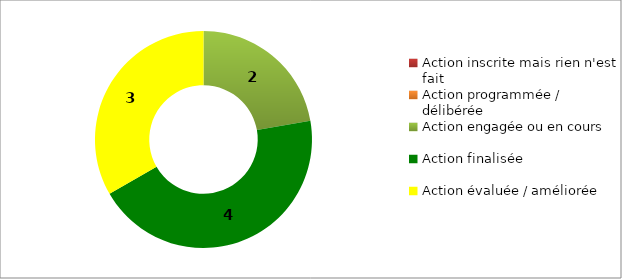
| Category | Series 0 |
|---|---|
| Action inscrite mais rien n'est fait | 0 |
| Action programmée / délibérée | 0 |
| Action engagée ou en cours | 2 |
| Action finalisée | 4 |
| Action évaluée / améliorée | 3 |